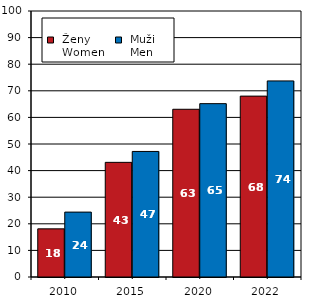
| Category |  Ženy 
 Women |  Muži 
 Men |
|---|---|---|
| 2010.0 | 18.1 | 24.4 |
| 2015.0 | 43.1 | 47.2 |
| 2020.0 | 63.054 | 65.173 |
| 2022.0 | 68 | 73.71 |